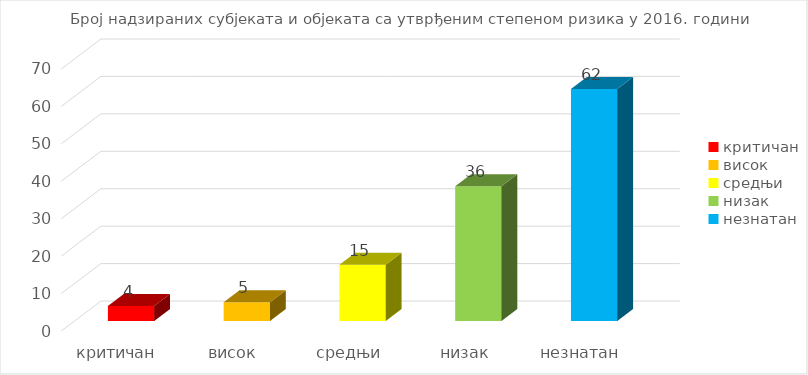
| Category | Series 0 |
|---|---|
| критичан | 4 |
| висок | 5 |
| средњи | 15 |
| низак | 36 |
| незнатан | 62 |